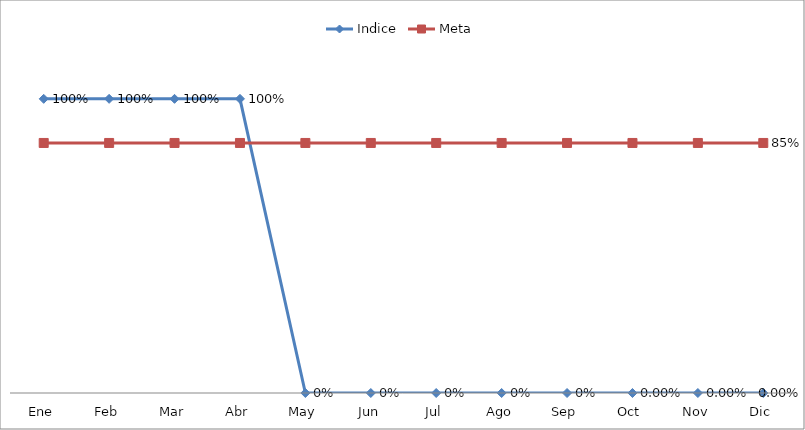
| Category | Indice | Meta |
|---|---|---|
| Ene | 1 | 0.85 |
| Feb | 1 | 0.85 |
| Mar | 1 | 0.85 |
| Abr | 1 | 0.85 |
| May | 0 | 0.85 |
| Jun | 0 | 0.85 |
| Jul | 0 | 0.85 |
| Ago | 0 | 0.85 |
| Sep | 0 | 0.85 |
| Oct | 0 | 0.85 |
| Nov | 0 | 0.85 |
| Dic | 0 | 0.85 |